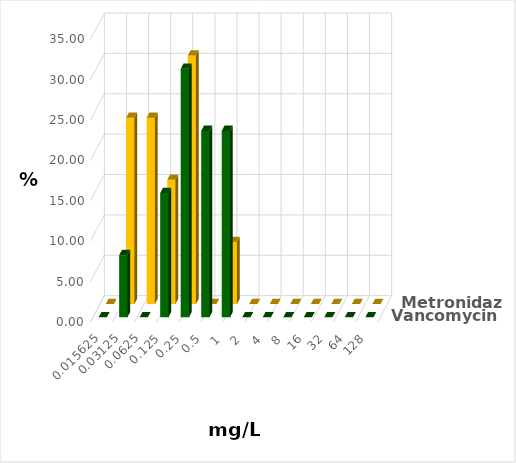
| Category | Vancomycin | Metronidazol |
|---|---|---|
| 0.015625 | 0 | 0 |
| 0.03125 | 7.692 | 23.077 |
| 0.0625 | 0 | 23.077 |
| 0.125 | 15.385 | 15.385 |
| 0.25 | 30.769 | 30.769 |
| 0.5 | 23.077 | 0 |
| 1.0 | 23.077 | 7.692 |
| 2.0 | 0 | 0 |
| 4.0 | 0 | 0 |
| 8.0 | 0 | 0 |
| 16.0 | 0 | 0 |
| 32.0 | 0 | 0 |
| 64.0 | 0 | 0 |
| 128.0 | 0 | 0 |